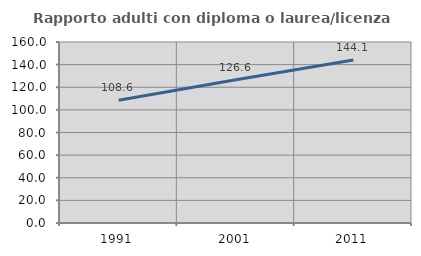
| Category | Rapporto adulti con diploma o laurea/licenza media  |
|---|---|
| 1991.0 | 108.594 |
| 2001.0 | 126.623 |
| 2011.0 | 144.079 |